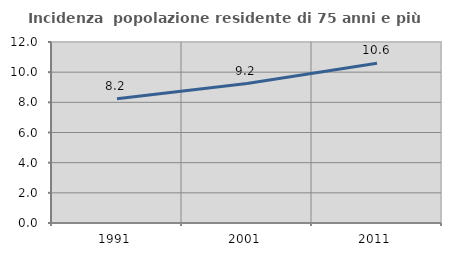
| Category | Incidenza  popolazione residente di 75 anni e più |
|---|---|
| 1991.0 | 8.238 |
| 2001.0 | 9.247 |
| 2011.0 | 10.593 |